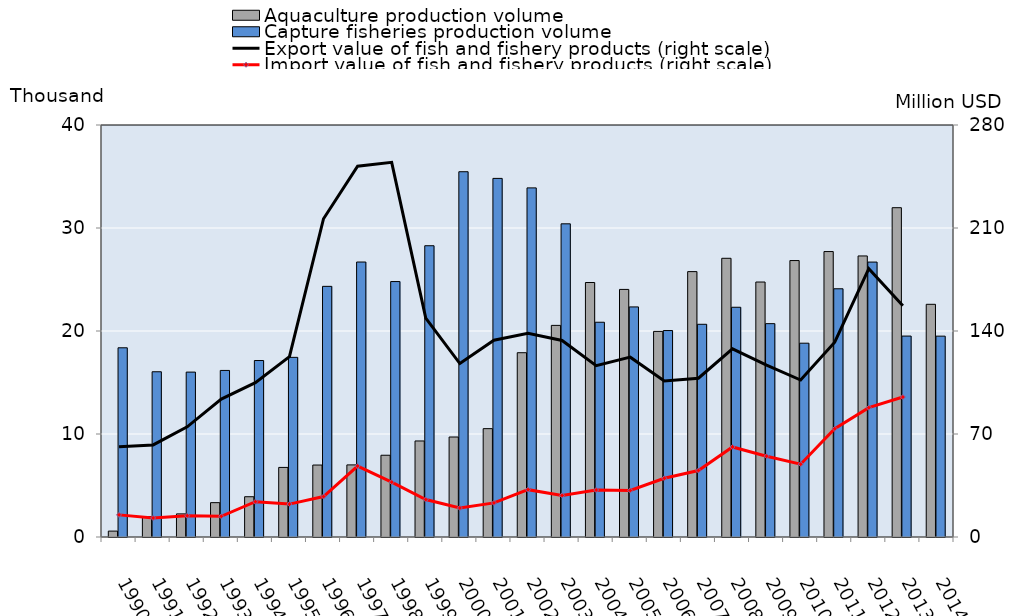
| Category | Aquaculture production volume | Capture fisheries production volume |
|---|---|---|
| 1990.0 | 0.573 | 18.37 |
| 1991.0 | 1.975 | 16.043 |
| 1992.0 | 2.244 | 16.01 |
| 1993.0 | 3.335 | 16.172 |
| 1994.0 | 3.91 | 17.134 |
| 1995.0 | 6.756 | 17.441 |
| 1996.0 | 6.986 | 24.335 |
| 1997.0 | 7 | 26.696 |
| 1998.0 | 7.937 | 24.8 |
| 1999.0 | 9.324 | 28.279 |
| 2000.0 | 9.708 | 35.463 |
| 2001.0 | 10.52 | 34.816 |
| 2002.0 | 17.892 | 33.895 |
| 2003.0 | 20.546 | 30.406 |
| 2004.0 | 24.708 | 20.85 |
| 2005.0 | 24.038 | 22.339 |
| 2006.0 | 19.962 | 20.045 |
| 2007.0 | 25.765 | 20.651 |
| 2008.0 | 27.059 | 22.305 |
| 2009.0 | 24.754 | 20.714 |
| 2010.0 | 26.839 | 18.816 |
| 2011.0 | 27.714 | 24.1 |
| 2012.0 | 27.287 | 26.692 |
| 2013.0 | 31.972 | 19.508 |
| 2014.0 | 22.592 | 19.5 |